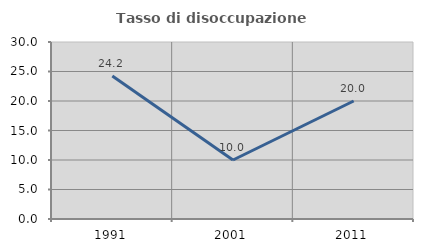
| Category | Tasso di disoccupazione giovanile  |
|---|---|
| 1991.0 | 24.242 |
| 2001.0 | 10 |
| 2011.0 | 20 |